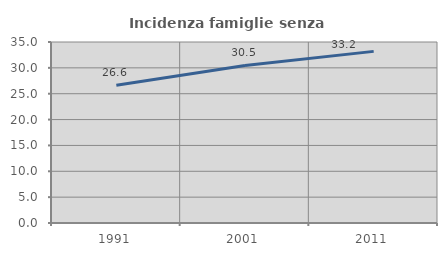
| Category | Incidenza famiglie senza nuclei |
|---|---|
| 1991.0 | 26.621 |
| 2001.0 | 30.467 |
| 2011.0 | 33.186 |